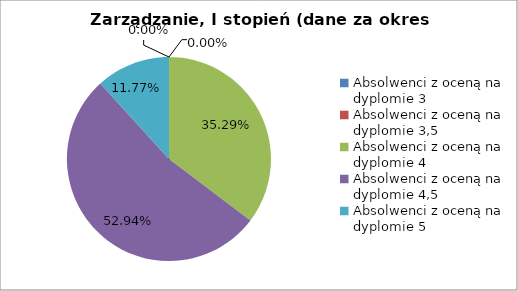
| Category | Series 0 |
|---|---|
| Absolwenci z oceną na dyplomie 3 | 0 |
| Absolwenci z oceną na dyplomie 3,5 | 0 |
| Absolwenci z oceną na dyplomie 4 | 35.294 |
| Absolwenci z oceną na dyplomie 4,5 | 52.941 |
| Absolwenci z oceną na dyplomie 5 | 11.765 |